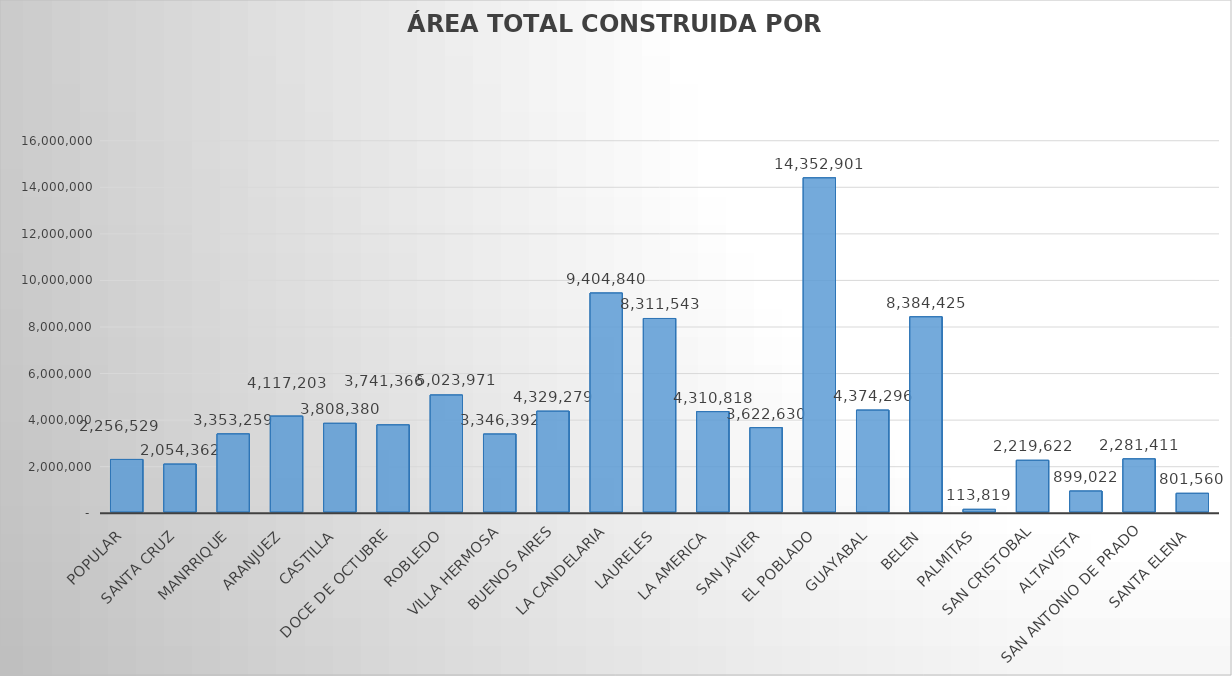
| Category | SumaDeAreaCons |
|---|---|
| POPULAR | 2256528.84 |
| SANTA CRUZ | 2054361.58 |
| MANRRIQUE | 3353259.04 |
| ARANJUEZ | 4117203.49 |
| CASTILLA | 3808380.2 |
| DOCE DE OCTUBRE | 3741365.83 |
| ROBLEDO | 5023971.18 |
| VILLA HERMOSA | 3346391.84 |
| BUENOS AIRES | 4329278.5 |
| LA CANDELARIA | 9404839.58 |
| LAURELES | 8311543.1 |
| LA AMERICA | 4310818.04 |
| SAN JAVIER | 3622630.23 |
| EL POBLADO | 14352901.47 |
| GUAYABAL | 4374296.45 |
| BELEN | 8384424.77 |
| PALMITAS | 113818.71 |
| SAN CRISTOBAL | 2219622.07 |
| ALTAVISTA | 899022.1 |
| SAN ANTONIO DE PRADO | 2281410.59 |
| SANTA ELENA | 801560.44 |